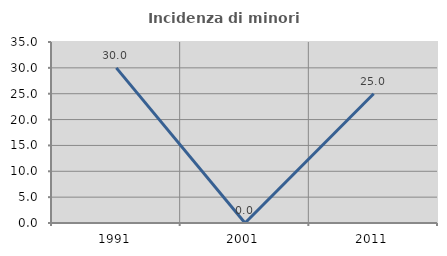
| Category | Incidenza di minori stranieri |
|---|---|
| 1991.0 | 30 |
| 2001.0 | 0 |
| 2011.0 | 25 |